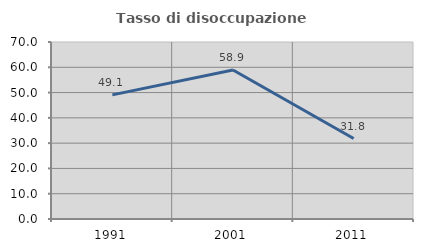
| Category | Tasso di disoccupazione giovanile  |
|---|---|
| 1991.0 | 49.091 |
| 2001.0 | 58.904 |
| 2011.0 | 31.818 |